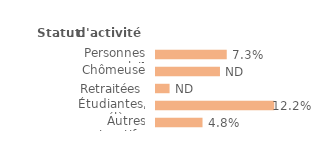
| Category | Series 0 |
|---|---|
| Personnes en emploi¹ | 0.073 |
| Chômeuses | 0.066 |
| Retraitées | 0.014 |
| Étudiantes, élèves | 0.122 |
| Autres inactifs  | 0.048 |